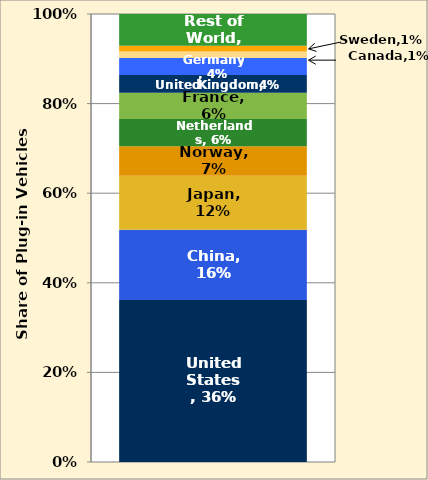
| Category | United States | China | Japan | Norway | Netherlands | France | United Kingdom | Germany | Canada | Sweden | Rest of World |
|---|---|---|---|---|---|---|---|---|---|---|---|
| 0 | 0.362 | 0.157 | 0.121 | 0.066 | 0.061 | 0.059 | 0.039 | 0.038 | 0.014 | 0.013 | 0.071 |